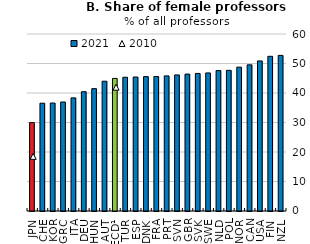
| Category | 2021 |
|---|---|
| JPN | 29.972 |
| CHE | 36.542 |
| KOR | 36.596 |
| GRC | 36.954 |
| ITA | 38.343 |
| DEU | 40.437 |
| HUN | 41.469 |
| AUT | 43.998 |
| OECD¹ | 44.94 |
| TUR | 45.339 |
| ESP | 45.417 |
| DNK | 45.551 |
| FRA | 45.586 |
| PRT | 45.801 |
| SVN | 46.132 |
| GBR | 46.401 |
| SVK | 46.633 |
| SWE | 46.804 |
| NLD | 47.606 |
| POL | 47.678 |
| NOR | 48.768 |
| CAN | 49.549 |
| USA | 50.873 |
| FIN | 52.432 |
| NZL | 52.743 |